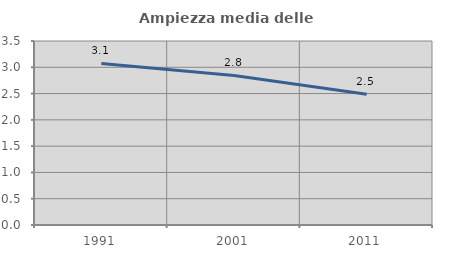
| Category | Ampiezza media delle famiglie |
|---|---|
| 1991.0 | 3.073 |
| 2001.0 | 2.845 |
| 2011.0 | 2.488 |